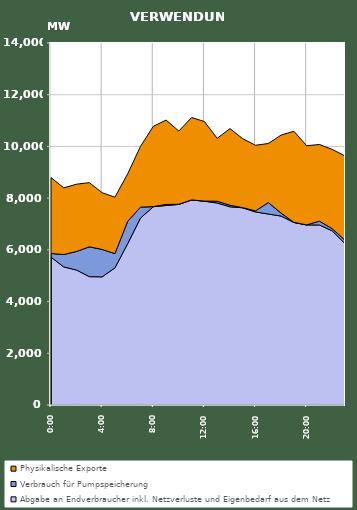
| Category | Abgabe an Endverbraucher inkl. Netzverluste und Eigenbedarf aus dem Netz | Verbrauch für Pumpspeicherung | Physikalische Exporte |
|---|---|---|---|
| 2007-01-17 | 5717.795 | 140.567 | 2935.234 |
| 2007-01-17 01:00:00 | 5339.835 | 478.251 | 2579.31 |
| 2007-01-17 02:00:00 | 5218.193 | 718.884 | 2602.884 |
| 2007-01-17 03:00:00 | 4963.646 | 1152.771 | 2482.993 |
| 2007-01-17 04:00:00 | 4956.199 | 1058.649 | 2195.415 |
| 2007-01-17 05:00:00 | 5303.079 | 550.738 | 2183.162 |
| 2007-01-17 06:00:00 | 6240.786 | 862.5 | 1838.622 |
| 2007-01-17 07:00:00 | 7227.676 | 423.314 | 2349.348 |
| 2007-01-17 08:00:00 | 7668.088 | 4.118 | 3100.976 |
| 2007-01-17 09:00:00 | 7714.881 | 43.487 | 3261.523 |
| 2007-01-17 10:00:00 | 7757.211 | 6.274 | 2829.6 |
| 2007-01-17 11:00:00 | 7928.214 | 3.871 | 3186.067 |
| 2007-01-17 12:00:00 | 7881.779 | 4.942 | 3077.123 |
| 2007-01-17 13:00:00 | 7810.766 | 69.265 | 2433.482 |
| 2007-01-17 14:00:00 | 7666.361 | 59.439 | 2964.418 |
| 2007-01-17 15:00:00 | 7626.575 | 4.48 | 2666.787 |
| 2007-01-17 16:00:00 | 7465.697 | 42.15 | 2536.848 |
| 2007-01-17 17:00:00 | 7385.62 | 443.87 | 2283.775 |
| 2007-01-17 18:00:00 | 7307.504 | 114.533 | 3018.137 |
| 2007-01-17 19:00:00 | 7060.239 | 3.303 | 3522.506 |
| 2007-01-17 20:00:00 | 6963.289 | 2.321 | 3060.567 |
| 2007-01-17 21:00:00 | 6961.556 | 147.609 | 2966.12 |
| 2007-01-17 22:00:00 | 6735.698 | 81.377 | 3067.606 |
| 2007-01-17 23:00:00 | 6245.126 | 127.917 | 3257.336 |